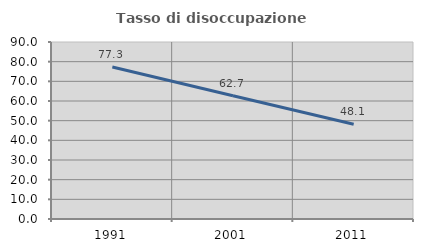
| Category | Tasso di disoccupazione giovanile  |
|---|---|
| 1991.0 | 77.273 |
| 2001.0 | 62.667 |
| 2011.0 | 48.148 |